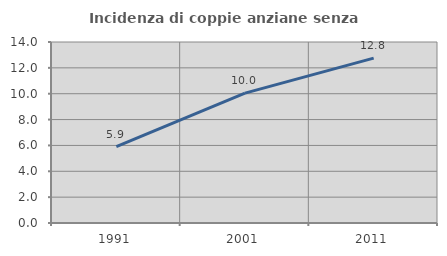
| Category | Incidenza di coppie anziane senza figli  |
|---|---|
| 1991.0 | 5.913 |
| 2001.0 | 10.05 |
| 2011.0 | 12.756 |